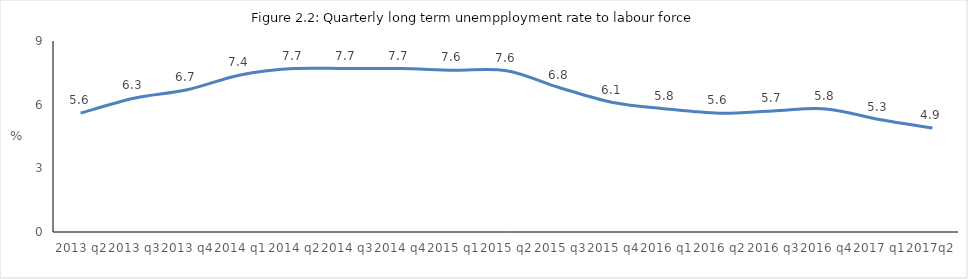
| Category |  >12 μήνες/εργατικό δυναμικό  |
|---|---|
| 2013 q2 | 5.6 |
| 2013 q3 | 6.3 |
| 2013 q4 | 6.7 |
| 2014 q1 | 7.4 |
| 2014 q2 | 7.7 |
| 2014 q3 | 7.7 |
| 2014 q4 | 7.7 |
| 2015 q1 | 7.625 |
| 2015 q2 | 7.6 |
| 2015 q3 | 6.8 |
| 2015 q4 | 6.1 |
| 2016 q1 | 5.8 |
| 2016 q2 | 5.6 |
| 2016 q3 | 5.7 |
| 2016 q4 | 5.8 |
| 2017 q1 | 5.3 |
| 2017q2 | 4.9 |